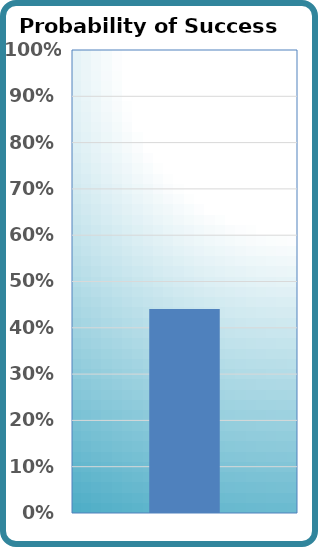
| Category | Probability of Success |
|---|---|
| 0 | 0.44 |